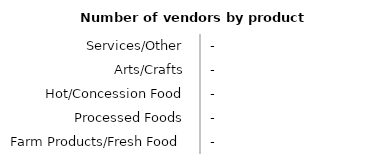
| Category | Series 0 |
|---|---|
| Farm Products/Fresh Food | 0 |
| Processed Foods | 0 |
| Hot/Concession Food | 0 |
| Arts/Crafts | 0 |
| Services/Other | 0 |